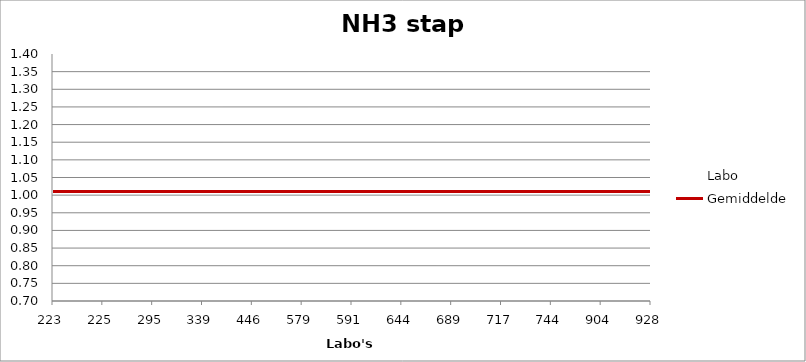
| Category | Labo | Gemiddelde |
|---|---|---|
| 223.0 | 0.933 | 1.01 |
| 225.0 | 1.043 | 1.01 |
| 295.0 | 0.963 | 1.01 |
| 339.0 | 0.994 | 1.01 |
| 446.0 | 1.037 | 1.01 |
| 579.0 | 1.043 | 1.01 |
| 591.0 | 1.049 | 1.01 |
| 644.0 | 0.988 | 1.01 |
| 689.0 | 0.749 | 1.01 |
| 717.0 | 1.049 | 1.01 |
| 744.0 | 1.013 | 1.01 |
| 904.0 | 1 | 1.01 |
| 928.0 | 1.319 | 1.01 |